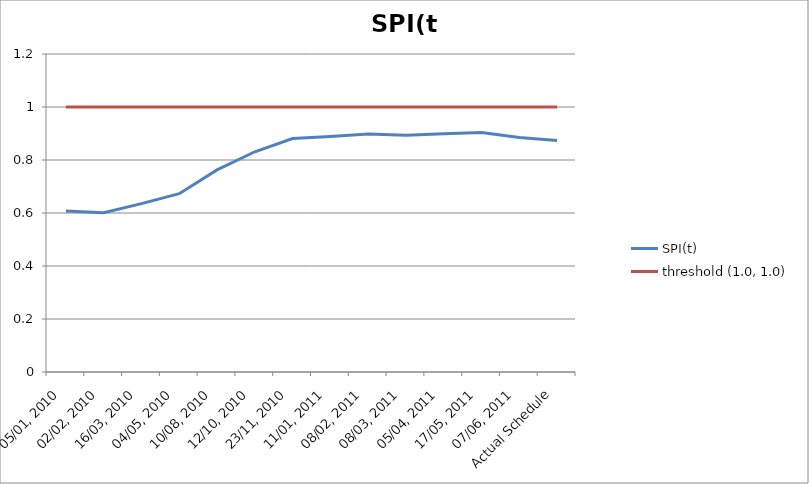
| Category | SPI(t) | threshold (1.0, 1.0) |
|---|---|---|
| 05/01, 2010 | 0.608 | 1 |
| 02/02, 2010 | 0.601 | 1 |
| 16/03, 2010 | 0.635 | 1 |
| 04/05, 2010 | 0.673 | 1 |
| 10/08, 2010 | 0.763 | 1 |
| 12/10, 2010 | 0.831 | 1 |
| 23/11, 2010 | 0.881 | 1 |
| 11/01, 2011 | 0.889 | 1 |
| 08/02, 2011 | 0.898 | 1 |
| 08/03, 2011 | 0.893 | 1 |
| 05/04, 2011 | 0.899 | 1 |
| 17/05, 2011 | 0.904 | 1 |
| 07/06, 2011 | 0.885 | 1 |
| Actual Schedule | 0.874 | 1 |